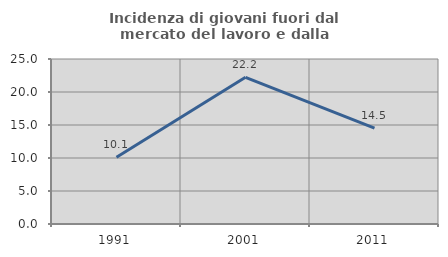
| Category | Incidenza di giovani fuori dal mercato del lavoro e dalla formazione  |
|---|---|
| 1991.0 | 10.12 |
| 2001.0 | 22.222 |
| 2011.0 | 14.539 |